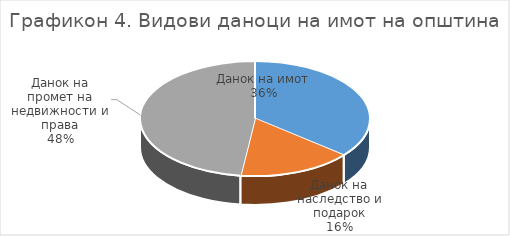
| Category | Структура |
|---|---|
| Данок на имот | 36 |
| Данок на наследство и подарок | 16 |
| Данок на промет на недвижности и права | 48 |